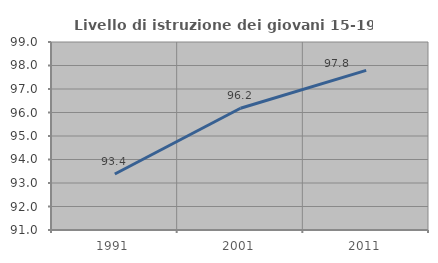
| Category | Livello di istruzione dei giovani 15-19 anni |
|---|---|
| 1991.0 | 93.381 |
| 2001.0 | 96.18 |
| 2011.0 | 97.792 |